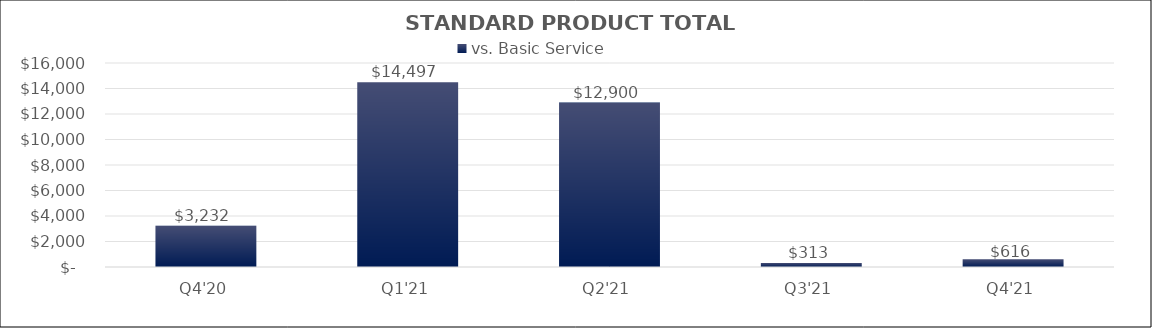
| Category | vs. Basic Service |
|---|---|
| Q4'20 | 3232.172 |
| Q1'21 | 14497.315 |
| Q2'21 | 12900.209 |
| Q3'21 | 312.535 |
| Q4'21 | 616.134 |